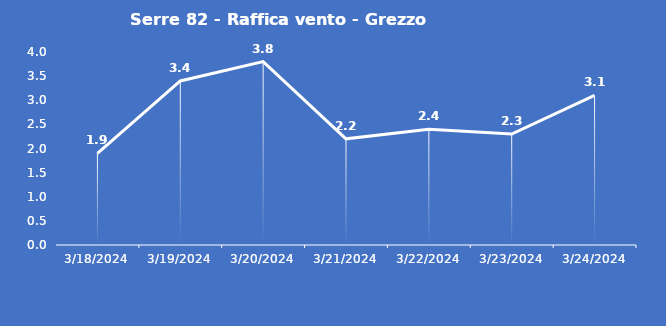
| Category | Serre 82 - Raffica vento - Grezzo (m/s) |
|---|---|
| 3/18/24 | 1.9 |
| 3/19/24 | 3.4 |
| 3/20/24 | 3.8 |
| 3/21/24 | 2.2 |
| 3/22/24 | 2.4 |
| 3/23/24 | 2.3 |
| 3/24/24 | 3.1 |